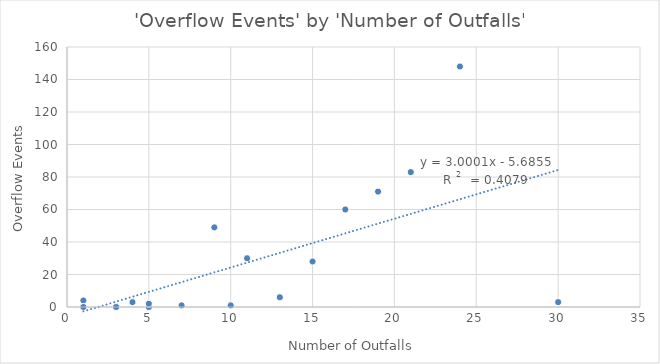
| Category | Series 0 |
|---|---|
| 1.0 | 4 |
| 1.0 | 0 |
| 1.0 | 0 |
| 3.0 | 0 |
| 3.0 | 0 |
| 4.0 | 3 |
| 5.0 | 0 |
| 5.0 | 2 |
| 7.0 | 1 |
| 9.0 | 49 |
| 10.0 | 1 |
| 11.0 | 30 |
| 13.0 | 6 |
| 15.0 | 28 |
| 17.0 | 60 |
| 19.0 | 71 |
| 21.0 | 83 |
| 24.0 | 148 |
| 30.0 | 3 |